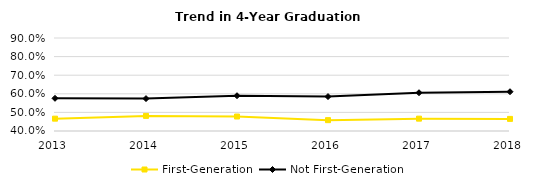
| Category | First-Generation | Not First-Generation |
|---|---|---|
| 2013.0 | 0.466 | 0.576 |
| 2014.0 | 0.481 | 0.574 |
| 2015.0 | 0.478 | 0.59 |
| 2016.0 | 0.458 | 0.585 |
| 2017.0 | 0.466 | 0.606 |
| 2018.0 | 0.465 | 0.611 |